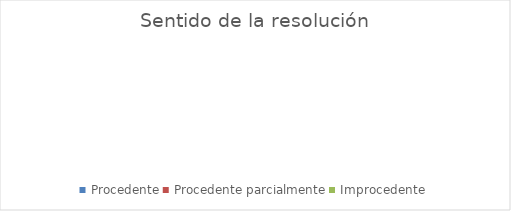
| Category | Series 0 |
|---|---|
| Procedente | 0 |
| Procedente parcialmente | 0 |
| Improcedente | 0 |